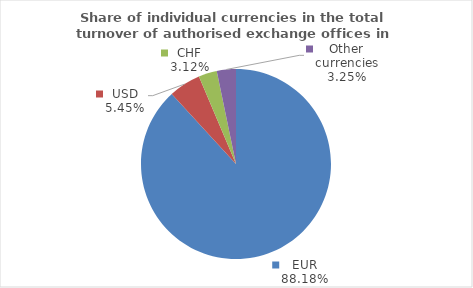
| Category | Series 0 |
|---|---|
| EUR | 88.175 |
| USD | 5.449 |
| CHF | 3.123 |
| Other currencies | 3.254 |